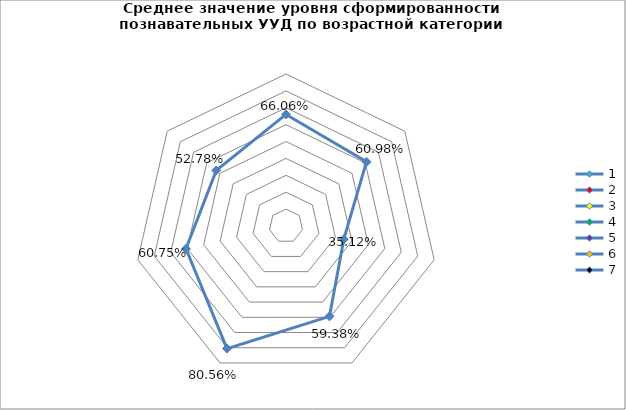
| Category | Series 0 |
|---|---|
| 0 | 0.661 |
| 1 | 0.61 |
| 2 | 0.351 |
| 3 | 0.594 |
| 4 | 0.806 |
| 5 | 0.607 |
| 6 | 0.528 |